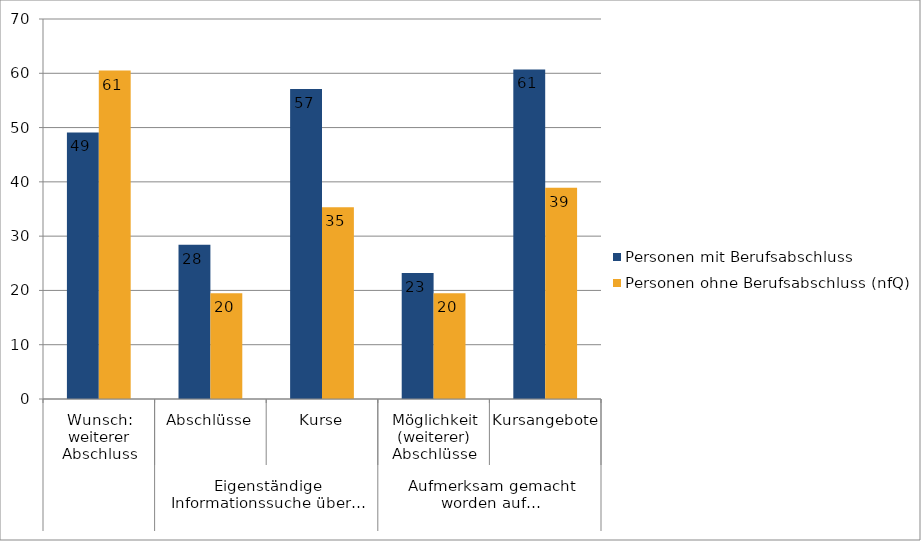
| Category | Personen mit Berufsabschluss | Personen ohne Berufsabschluss (nfQ) |
|---|---|---|
| 0 | 49.1 | 60.5 |
| 1 | 28.4 | 19.5 |
| 2 | 57.1 | 35.3 |
| 3 | 23.2 | 19.5 |
| 4 | 60.7 | 38.9 |